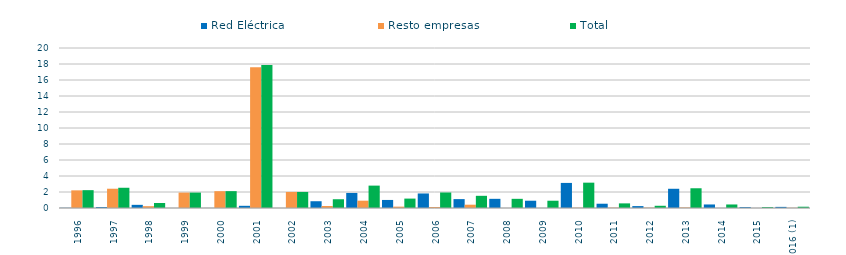
| Category | Red Eléctrica | Resto empresas | Total |
|---|---|---|---|
| 1996 | 0.024 | 2.206 | 2.23 |
| 1997 | 0.12 | 2.41 | 2.53 |
| 1998 | 0.395 | 0.227 | 0.622 |
| 1999 | 0.001 | 1.926 | 1.927 |
| 2000 | 0.004 | 2.103 | 2.107 |
| 2001 | 0.274 | 17.594 | 17.868 |
| 2002 | 0 | 2.006 | 2.006 |
| 2003 | 0.846 | 0.249 | 1.095 |
| 2004 | 1.882 | 0.916 | 2.798 |
| 2005 | 1.006 | 0.17 | 1.176 |
| 2006 | 1.817 | 0.122 | 1.939 |
| 2007 | 1.111 | 0.412 | 1.523 |
| 2008 | 1.147 | 0 | 1.147 |
| 2009 | 0.91 | 0 | 0.91 |
| 2010 | 3.135 | 0.032 | 3.167 |
| 2011 | 0.535 | 0.042 | 0.577 |
| 2012 | 0.238 | 0.04 | 0.278 |
| 2013 | 2.403 | 0.064 | 2.467 |
| 2014 | 0.441 | 0 | 0.441 |
| 2015 | 0.112 | 0 | 0.112 |
| 2016 (1) | 0.14 | 0.02 | 0.16 |